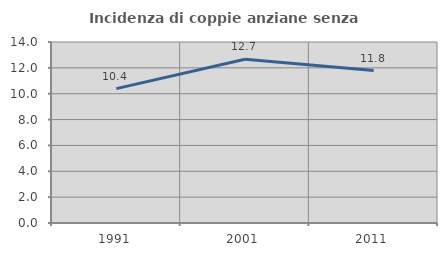
| Category | Incidenza di coppie anziane senza figli  |
|---|---|
| 1991.0 | 10.396 |
| 2001.0 | 12.67 |
| 2011.0 | 11.792 |